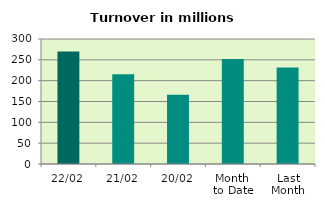
| Category | Series 0 |
|---|---|
| 22/02 | 270.041 |
| 21/02 | 215.364 |
| 20/02 | 166.484 |
| Month 
to Date | 251.912 |
| Last
Month | 231.348 |